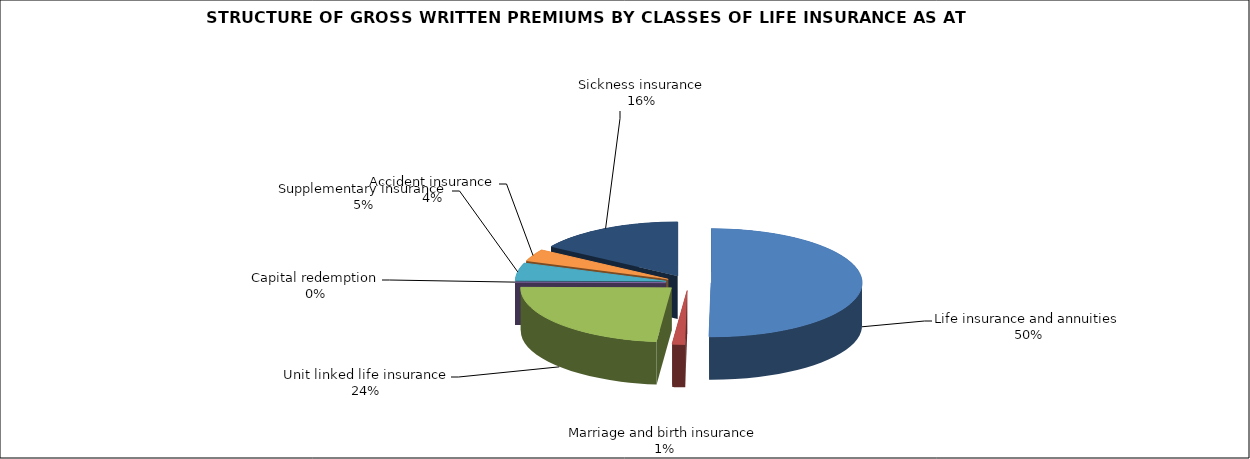
| Category | Life insurance and annuities |
|---|---|
| Life insurance and annuities | 0.502 |
| Marriage and birth insurance | 0.014 |
| Unit linked life insurance | 0.236 |
| Capital redemption | 0 |
| Supplementary insurance | 0.053 |
| Accident insurance | 0.037 |
| Sickness insurance | 0.159 |